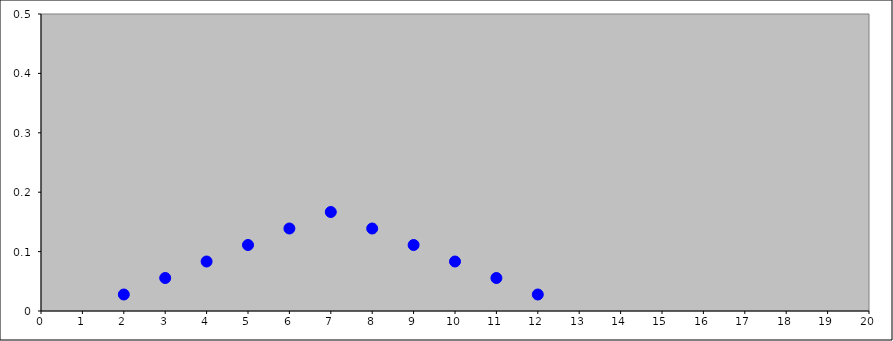
| Category | Series 0 |
|---|---|
| 2.0 | 0.028 |
| 3.0 | 0.056 |
| 4.0 | 0.083 |
| 5.0 | 0.111 |
| 6.0 | 0.139 |
| 7.0 | 0.167 |
| 8.0 | 0.139 |
| 9.0 | 0.111 |
| 10.0 | 0.083 |
| 11.0 | 0.056 |
| 12.0 | 0.028 |